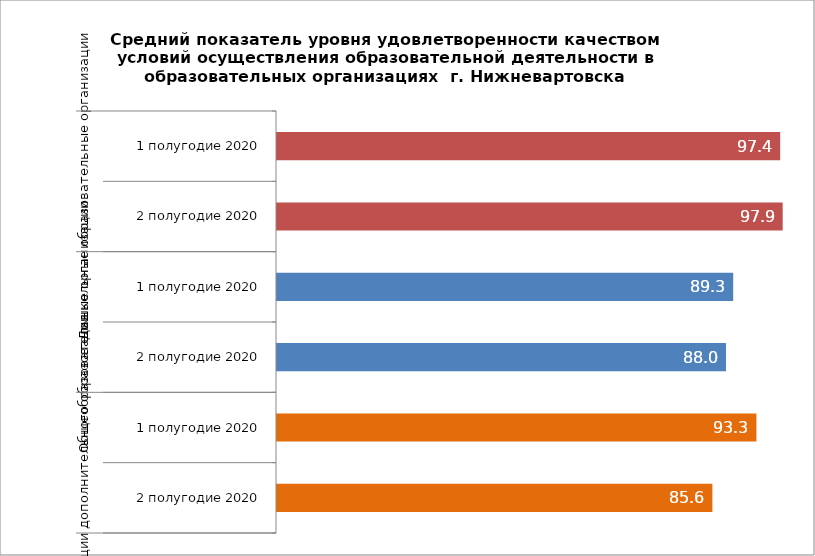
| Category | Series 0 |
|---|---|
| 0 | 97.422 |
| 1 | 97.861 |
| 2 | 89.263 |
| 3 | 88.01 |
| 4 | 93.297 |
| 5 | 85.645 |